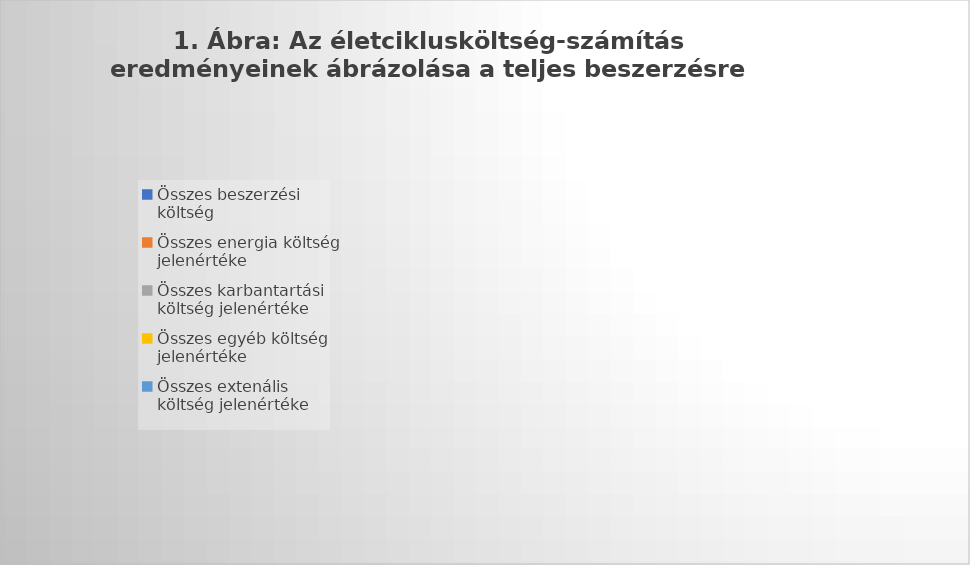
| Category | Series 0 |
|---|---|
| Összes beszerzési költség | 0 |
| Összes energia költség jelenértéke | 0 |
| Összes karbantartási költség jelenértéke | 0 |
| Összes egyéb költség jelenértéke | 0 |
| Összes extenális költség jelenértéke | 0 |